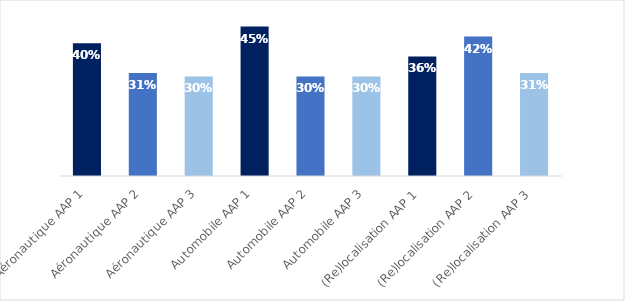
| Category | Taux de sélectivité |
|---|---|
| Aéronautique AAP 1 | 0.4 |
| Aéronautique AAP 2 | 0.31 |
| Aéronautique AAP 3 | 0.3 |
| Automobile AAP 1 | 0.45 |
| Automobile AAP 2 | 0.3 |
| Automobile AAP 3 | 0.3 |
| (Re)localisation AAP 1 | 0.36 |
| (Re)localisation AAP 2 | 0.42 |
| (Re)localisation AAP 3 | 0.31 |